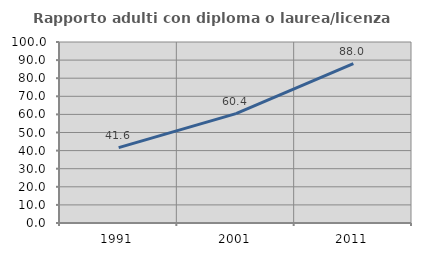
| Category | Rapporto adulti con diploma o laurea/licenza media  |
|---|---|
| 1991.0 | 41.614 |
| 2001.0 | 60.426 |
| 2011.0 | 88.016 |